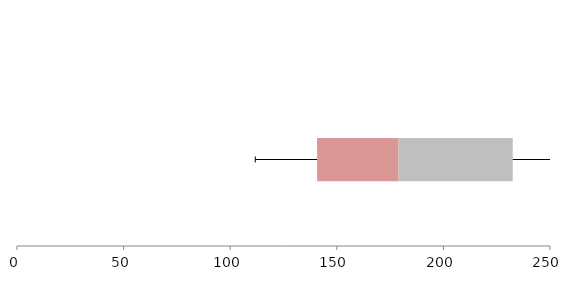
| Category | Series 1 | Series 2 | Series 3 |
|---|---|---|---|
| 0 | 140.756 | 38.228 | 53.531 |